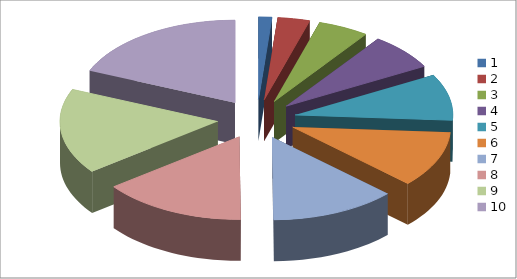
| Category | Series 0 |
|---|---|
| 0 | 5 |
| 1 | 12 |
| 2 | 19 |
| 3 | 26 |
| 4 | 33 |
| 5 | 40 |
| 6 | 47 |
| 7 | 54 |
| 8 | 61 |
| 9 | 68 |